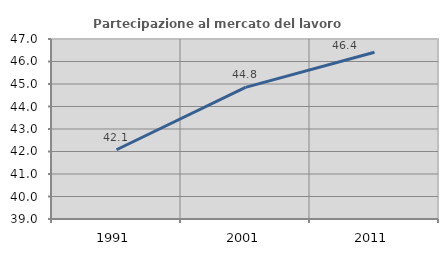
| Category | Partecipazione al mercato del lavoro  femminile |
|---|---|
| 1991.0 | 42.079 |
| 2001.0 | 44.85 |
| 2011.0 | 46.41 |